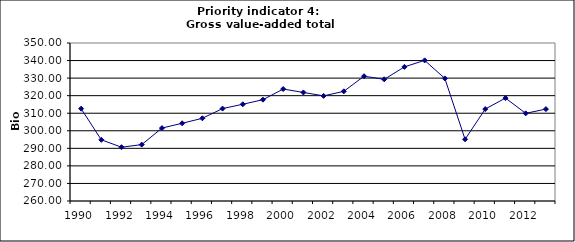
| Category | Gross value-added total industry, Bio Euro (EC95) |
|---|---|
| 1990 | 312.603 |
| 1991 | 294.857 |
| 1992 | 290.642 |
| 1993 | 292.115 |
| 1994 | 301.54 |
| 1995 | 304.276 |
| 1996 | 307.115 |
| 1997 | 312.652 |
| 1998 | 315.093 |
| 1999 | 317.704 |
| 2000 | 323.779 |
| 2001 | 321.834 |
| 2002 | 319.876 |
| 2003 | 322.472 |
| 2004 | 331.07 |
| 2005 | 329.311 |
| 2006 | 336.406 |
| 2007 | 340.104 |
| 2008 | 329.807 |
| 2009 | 295.141 |
| 2010 | 312.367 |
| 2011 | 318.624 |
| 2012 | 309.947 |
| 2013 | 312.338 |